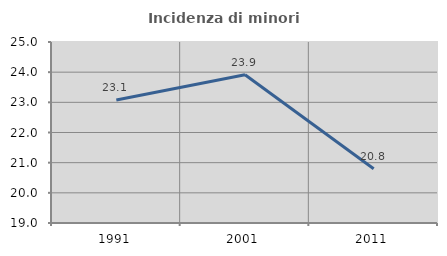
| Category | Incidenza di minori stranieri |
|---|---|
| 1991.0 | 23.077 |
| 2001.0 | 23.913 |
| 2011.0 | 20.796 |